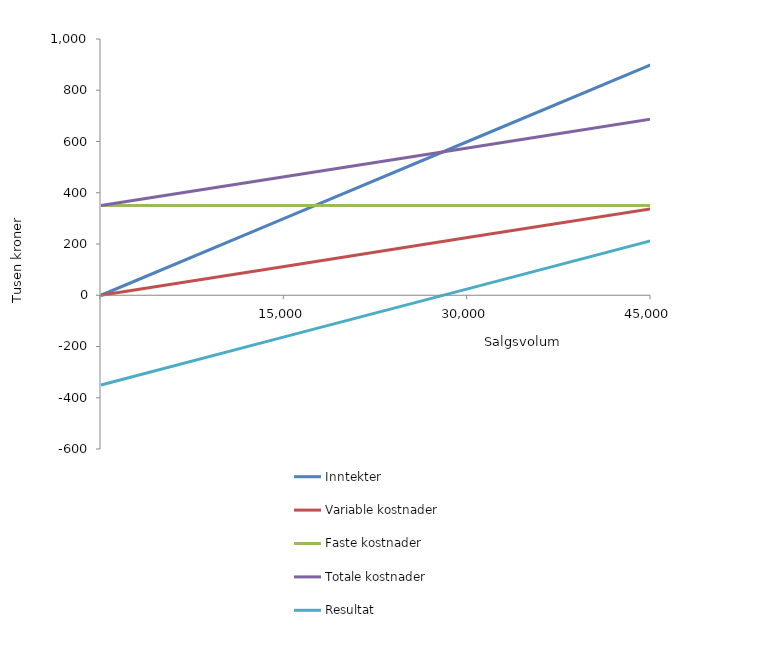
| Category | Inntekter | Variable kostnader  | Faste kostnader | Totale kostnader  | Resultat |
|---|---|---|---|---|---|
| nan | 0 | 0 | 350 | 350 | -350 |
| 15000.0 | 300 | 112.5 | 350 | 462.5 | -162.5 |
| 30000.0 | 600 | 225 | 350 | 575 | 25 |
| 45000.0 | 900 | 337.5 | 350 | 687.5 | 212.5 |